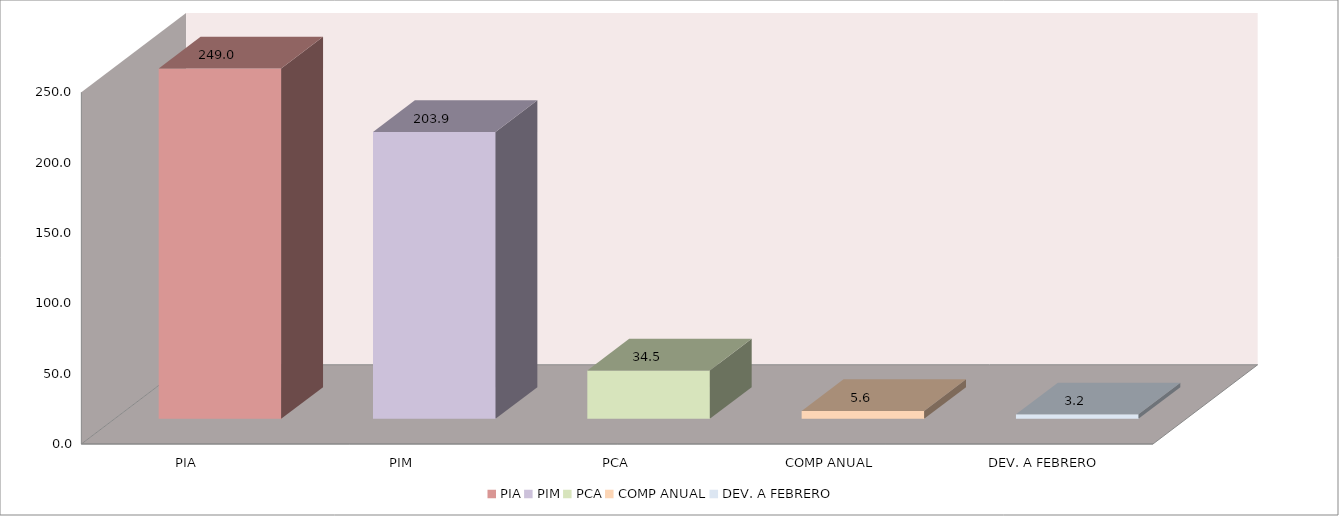
| Category | 011 MINISTERIO DE SALUD |
|---|---|
| PIA | 249.028 |
| PIM | 203.887 |
| PCA | 34.45 |
| COMP ANUAL | 5.589 |
| DEV. A FEBRERO | 3.181 |